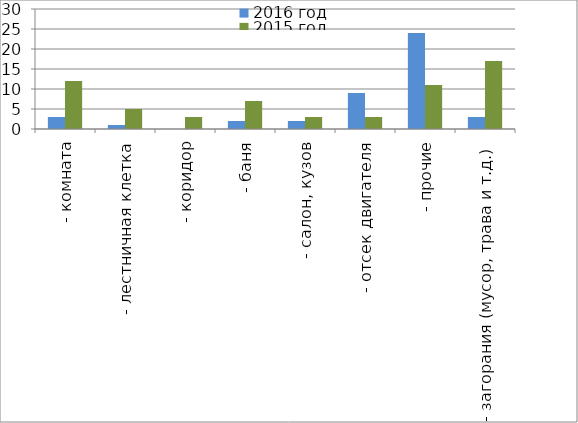
| Category | 2016 год | 2015 год |
|---|---|---|
|  - комната | 3 | 12 |
|  - лестничная клетка | 1 | 5 |
|  - коридор | 0 | 3 |
|  - баня | 2 | 7 |
|  - салон, кузов | 2 | 3 |
|  - отсек двигателя | 9 | 3 |
| - прочие | 24 | 11 |
| - загорания (мусор, трава и т.д.)  | 3 | 17 |